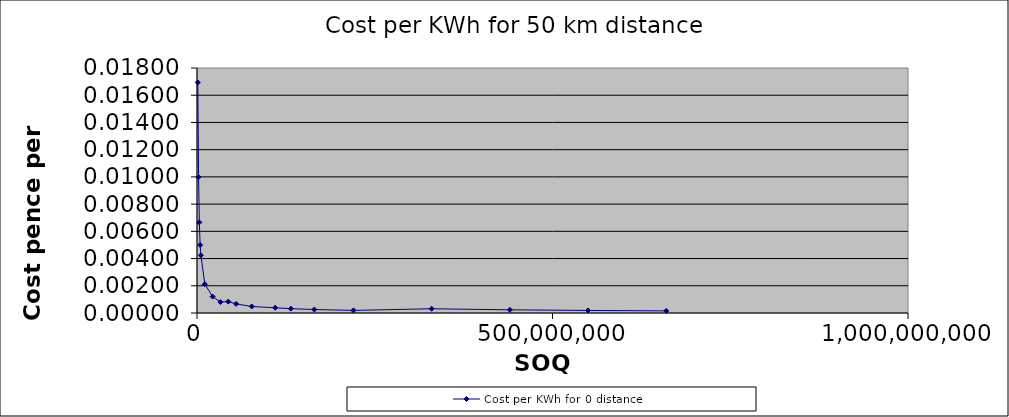
| Category | Cost per KWh for 0 distance |
|---|---|
| 660000000.0 | 0 |
| 550000000.0 | 0 |
| 440000000.0 | 0 |
| 330000000.0 | 0 |
| 220000000.0 | 0 |
| 165000000.0 | 0 |
| 132000000.0 | 0 |
| 110000000.0 | 0 |
| 77000000.0 | 0 |
| 55000000.0 | 0.001 |
| 44000000.0 | 0.001 |
| 33000000.0 | 0.001 |
| 22000000.0 | 0.001 |
| 11000000.0 | 0.002 |
| 5500000.0 | 0.004 |
| 4400000.0 | 0.005 |
| 3300000.0 | 0.007 |
| 2200000.0 | 0.01 |
| 1100000.0 | 0.017 |